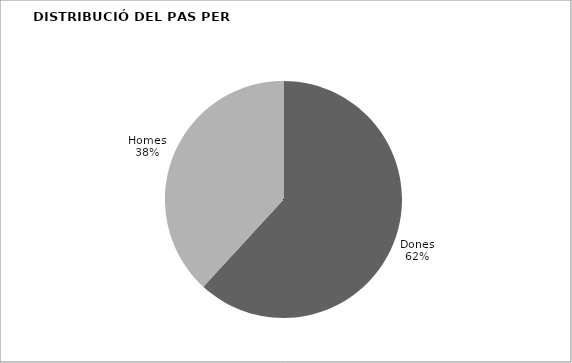
| Category | Series 0 |
|---|---|
| Dones | 915 |
| Homes | 565 |